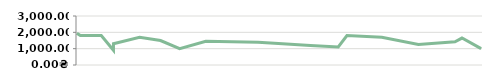
| Category | ПРИБУТОК |
|---|---|
| 2013-04-23 | 1950 |
| 2013-04-25 | 1800 |
| 2013-05-07 | 1800 |
| 2013-05-14 | 900 |
| 2013-05-14 | 1300 |
| 2013-05-29 | 1700 |
| 2013-06-10 | 1500 |
| 2013-06-21 | 1000 |
| 2013-07-06 | 1450 |
| 2013-08-05 | 1400 |
| 2013-08-19 | 1300 |
| 2013-09-04 | 1200 |
| 2013-09-20 | 1100 |
| 2013-09-25 | 1800 |
| 2013-10-15 | 1700 |
| 2013-11-05 | 1250 |
| 2013-11-26 | 1425 |
| 2013-11-30 | 1650 |
| 2013-12-11 | 1000 |